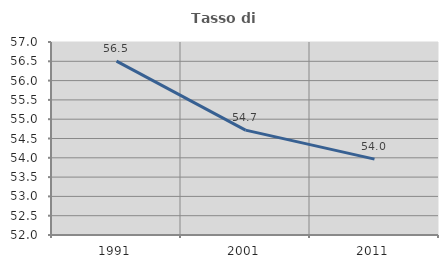
| Category | Tasso di occupazione   |
|---|---|
| 1991.0 | 56.503 |
| 2001.0 | 54.716 |
| 2011.0 | 53.965 |